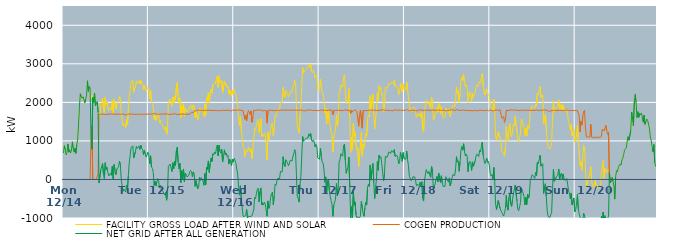
| Category | FACILITY GROSS LOAD AFTER WIND AND SOLAR | COGEN PRODUCTION | NET GRID AFTER ALL GENERATION |
|---|---|---|---|
|  Mon  12/14 | 686 | 0 | 686 |
|  Mon  12/14 | 877 | 0 | 877 |
|  Mon  12/14 | 775 | 0 | 775 |
|  Mon  12/14 | 638 | 0 | 638 |
|  Mon  12/14 | 699 | 0 | 699 |
|  Mon  12/14 | 922 | 0 | 922 |
|  Mon  12/14 | 709 | 0 | 709 |
|  Mon  12/14 | 772 | 0 | 772 |
|  Mon  12/14 | 685 | 0 | 685 |
|  Mon  12/14 | 762 | 0 | 762 |
|  Mon  12/14 | 978 | 0 | 978 |
|  Mon  12/14 | 806 | 0 | 806 |
|  Mon  12/14 | 710 | 0 | 710 |
|  Mon  12/14 | 811 | 0 | 811 |
|  Mon  12/14 | 678 | 0 | 678 |
|  Mon  12/14 | 904 | 0 | 904 |
|  Mon  12/14 | 1043 | 0 | 1043 |
|  Mon  12/14 | 1416 | 0 | 1416 |
|  Mon  12/14 | 1896 | 0 | 1896 |
|  Mon  12/14 | 2225 | 0 | 2225 |
|  Mon  12/14 | 2151 | 0 | 2151 |
|  Mon  12/14 | 2109 | 0 | 2109 |
|  Mon  12/14 | 2145 | 0 | 2145 |
|  Mon  12/14 | 2076 | 0 | 2076 |
|  Mon  12/14 | 1991 | 0 | 1991 |
|  Mon  12/14 | 2085 | 0 | 2085 |
|  Mon  12/14 | 2187 | 0 | 2187 |
|  Mon  12/14 | 2560 | 0 | 2560 |
|  Mon  12/14 | 2285 | 0 | 2285 |
|  Mon  12/14 | 2413 | 0 | 2413 |
|  Mon  12/14 | 2372 | 0 | 2372 |
|  Mon  12/14 | 2094 | 992 | 1102 |
|  Mon  12/14 | 2180 | 1396 | 784 |
|  Mon  12/14 | 2130 | 0 | 2130 |
|  Mon  12/14 | 1999 | 0 | 1999 |
|  Mon  12/14 | 2235 | 0 | 2235 |
|  Mon  12/14 | 1907 | 0 | 1907 |
|  Mon  12/14 | 1952 | 0 | 1952 |
|  Mon  12/14 | 2021 | 0 | 2021 |
|  Mon  12/14 | 1903 | 153 | 1750 |
|  Mon  12/14 | 1593 | 1685 | -92 |
|  Mon  12/14 | 1621 | 1691 | -70 |
|  Mon  12/14 | 1948 | 1695 | 253 |
|  Mon  12/14 | 1963 | 1693 | 270 |
|  Mon  12/14 | 2107 | 1694 | 413 |
|  Mon  12/14 | 1837 | 1693 | 144 |
|  Mon  12/14 | 1718 | 1694 | 24 |
|  Mon  12/14 | 2124 | 1690 | 434 |
|  Mon  12/14 | 1940 | 1684 | 256 |
|  Mon  12/14 | 2005 | 1692 | 313 |
|  Mon  12/14 | 1866 | 1685 | 181 |
|  Mon  12/14 | 1786 | 1695 | 91 |
|  Mon  12/14 | 1816 | 1697 | 119 |
|  Mon  12/14 | 1859 | 1696 | 163 |
|  Mon  12/14 | 1807 | 1698 | 109 |
|  Mon  12/14 | 2042 | 1701 | 341 |
|  Mon  12/14 | 1700 | 1700 | 0 |
|  Mon  12/14 | 2078 | 1692 | 386 |
|  Mon  12/14 | 1932 | 1694 | 238 |
|  Mon  12/14 | 1822 | 1698 | 124 |
|  Mon  12/14 | 1950 | 1687 | 263 |
|  Mon  12/14 | 1947 | 1699 | 248 |
|  Mon  12/14 | 2030 | 1702 | 328 |
|  Mon  12/14 | 2149 | 1681 | 468 |
|  Mon  12/14 | 2078 | 1685 | 393 |
|  Mon  12/14 | 1693 | 1697 | -4 |
|  Mon  12/14 | 1533 | 1699 | -166 |
|  Mon  12/14 | 1387 | 1696 | -309 |
|  Mon  12/14 | 1447 | 1697 | -250 |
|  Mon  12/14 | 1421 | 1687 | -266 |
|  Mon  12/14 | 1342 | 1670 | -328 |
|  Mon  12/14 | 1550 | 1693 | -143 |
|  Mon  12/14 | 1425 | 1693 | -268 |
|  Mon  12/14 | 1797 | 1695 | 102 |
|  Mon  12/14 | 2134 | 1697 | 437 |
|  Mon  12/14 | 2315 | 1691 | 624 |
|  Mon  12/14 | 2521 | 1700 | 821 |
|  Mon  12/14 | 2505 | 1683 | 822 |
|  Mon  12/14 | 2565 | 1694 | 871 |
|  Mon  12/14 | 2255 | 1699 | 556 |
|  Mon  12/14 | 2260 | 1684 | 576 |
|  Mon  12/14 | 2426 | 1699 | 727 |
|  Mon  12/14 | 2557 | 1697 | 860 |
|  Mon  12/14 | 2493 | 1691 | 802 |
|  Mon  12/14 | 2506 | 1687 | 819 |
|  Mon  12/14 | 2563 | 1695 | 868 |
|  Mon  12/14 | 2475 | 1695 | 780 |
|  Mon  12/14 | 2575 | 1689 | 886 |
|  Mon  12/14 | 2498 | 1690 | 808 |
|  Mon  12/14 | 2458 | 1681 | 777 |
|  Mon  12/14 | 2331 | 1690 | 641 |
|  Mon  12/14 | 2448 | 1695 | 753 |
|  Mon  12/14 | 2355 | 1691 | 664 |
|  Mon  12/14 | 2287 | 1708 | 579 |
|  Mon  12/14 | 2330 | 1694 | 636 |
|  Mon  12/14 | 2401 | 1695 | 706 |
|  Tue  12/15 | 2338 | 1700 | 638 |
|  Tue  12/15 | 2092 | 1682 | 410 |
|  Tue  12/15 | 2309 | 1696 | 613 |
|  Tue  12/15 | 2020 | 1690 | 330 |
|  Tue  12/15 | 1982 | 1697 | 285 |
|  Tue  12/15 | 1865 | 1678 | 187 |
|  Tue  12/15 | 1557 | 1712 | -155 |
|  Tue  12/15 | 1654 | 1700 | -46 |
|  Tue  12/15 | 1532 | 1696 | -164 |
|  Tue  12/15 | 1626 | 1699 | -73 |
|  Tue  12/15 | 1712 | 1689 | 23 |
|  Tue  12/15 | 1680 | 1706 | -26 |
|  Tue  12/15 | 1472 | 1691 | -219 |
|  Tue  12/15 | 1535 | 1692 | -157 |
|  Tue  12/15 | 1441 | 1694 | -253 |
|  Tue  12/15 | 1420 | 1692 | -272 |
|  Tue  12/15 | 1385 | 1701 | -316 |
|  Tue  12/15 | 1378 | 1689 | -311 |
|  Tue  12/15 | 1291 | 1695 | -404 |
|  Tue  12/15 | 1367 | 1708 | -341 |
|  Tue  12/15 | 1166 | 1705 | -539 |
|  Tue  12/15 | 1298 | 1695 | -397 |
|  Tue  12/15 | 2030 | 1693 | 337 |
|  Tue  12/15 | 2008 | 1693 | 315 |
|  Tue  12/15 | 2083 | 1683 | 400 |
|  Tue  12/15 | 1988 | 1690 | 298 |
|  Tue  12/15 | 1900 | 1694 | 206 |
|  Tue  12/15 | 2138 | 1705 | 433 |
|  Tue  12/15 | 1982 | 1703 | 279 |
|  Tue  12/15 | 2165 | 1696 | 469 |
|  Tue  12/15 | 2066 | 1702 | 364 |
|  Tue  12/15 | 2421 | 1683 | 738 |
|  Tue  12/15 | 2522 | 1682 | 840 |
|  Tue  12/15 | 2148 | 1696 | 452 |
|  Tue  12/15 | 1966 | 1691 | 275 |
|  Tue  12/15 | 2107 | 1690 | 417 |
|  Tue  12/15 | 1607 | 1688 | -81 |
|  Tue  12/15 | 1931 | 1700 | 231 |
|  Tue  12/15 | 1719 | 1701 | 18 |
|  Tue  12/15 | 1966 | 1694 | 272 |
|  Tue  12/15 | 1639 | 1693 | -54 |
|  Tue  12/15 | 1856 | 1692 | 164 |
|  Tue  12/15 | 1798 | 1687 | 111 |
|  Tue  12/15 | 1757 | 1691 | 66 |
|  Tue  12/15 | 1771 | 1693 | 78 |
|  Tue  12/15 | 1788 | 1681 | 107 |
|  Tue  12/15 | 1896 | 1697 | 199 |
|  Tue  12/15 | 1933 | 1699 | 234 |
|  Tue  12/15 | 1941 | 1734 | 207 |
|  Tue  12/15 | 1803 | 1737 | 66 |
|  Tue  12/15 | 1938 | 1741 | 197 |
|  Tue  12/15 | 1898 | 1741 | 157 |
|  Tue  12/15 | 1601 | 1780 | -179 |
|  Tue  12/15 | 1768 | 1799 | -31 |
|  Tue  12/15 | 1743 | 1786 | -43 |
|  Tue  12/15 | 1548 | 1791 | -243 |
|  Tue  12/15 | 1589 | 1801 | -212 |
|  Tue  12/15 | 1853 | 1796 | 57 |
|  Tue  12/15 | 1775 | 1799 | -24 |
|  Tue  12/15 | 1839 | 1792 | 47 |
|  Tue  12/15 | 1839 | 1796 | 43 |
|  Tue  12/15 | 1748 | 1788 | -40 |
|  Tue  12/15 | 1631 | 1783 | -152 |
|  Tue  12/15 | 1949 | 1796 | 153 |
|  Tue  12/15 | 1664 | 1799 | -135 |
|  Tue  12/15 | 2118 | 1799 | 319 |
|  Tue  12/15 | 2050 | 1790 | 260 |
|  Tue  12/15 | 2253 | 1772 | 481 |
|  Tue  12/15 | 1979 | 1798 | 181 |
|  Tue  12/15 | 2221 | 1806 | 415 |
|  Tue  12/15 | 2348 | 1789 | 559 |
|  Tue  12/15 | 2236 | 1771 | 465 |
|  Tue  12/15 | 2454 | 1787 | 667 |
|  Tue  12/15 | 2432 | 1794 | 638 |
|  Tue  12/15 | 2505 | 1792 | 713 |
|  Tue  12/15 | 2477 | 1806 | 671 |
|  Tue  12/15 | 2596 | 1790 | 806 |
|  Tue  12/15 | 2676 | 1786 | 890 |
|  Tue  12/15 | 2392 | 1779 | 613 |
|  Tue  12/15 | 2686 | 1794 | 892 |
|  Tue  12/15 | 2518 | 1794 | 724 |
|  Tue  12/15 | 2472 | 1789 | 683 |
|  Tue  12/15 | 2563 | 1783 | 780 |
|  Tue  12/15 | 2248 | 1791 | 457 |
|  Tue  12/15 | 2394 | 1801 | 593 |
|  Tue  12/15 | 2558 | 1788 | 770 |
|  Tue  12/15 | 2433 | 1788 | 645 |
|  Tue  12/15 | 2480 | 1796 | 684 |
|  Tue  12/15 | 2387 | 1790 | 597 |
|  Tue  12/15 | 2428 | 1801 | 627 |
|  Tue  12/15 | 2203 | 1804 | 399 |
|  Tue  12/15 | 2316 | 1793 | 523 |
|  Tue  12/15 | 2216 | 1773 | 443 |
|  Tue  12/15 | 2156 | 1794 | 362 |
|  Tue  12/15 | 2320 | 1796 | 524 |
|  Tue  12/15 | 2233 | 1782 | 451 |
|  Wed  12/16 | 2345 | 1797 | 548 |
|  Wed  12/16 | 2278 | 1787 | 491 |
|  Wed  12/16 | 2207 | 1799 | 408 |
|  Wed  12/16 | 2054 | 1790 | 264 |
|  Wed  12/16 | 1917 | 1796 | 121 |
|  Wed  12/16 | 1572 | 1785 | -213 |
|  Wed  12/16 | 1397 | 1804 | -407 |
|  Wed  12/16 | 1629 | 1793 | -164 |
|  Wed  12/16 | 1288 | 1787 | -499 |
|  Wed  12/16 | 1293 | 1791 | -498 |
|  Wed  12/16 | 850 | 1793 | -943 |
|  Wed  12/16 | 822 | 1793 | -971 |
|  Wed  12/16 | 596 | 1559 | -963 |
|  Wed  12/16 | 754 | 1672 | -918 |
|  Wed  12/16 | 738 | 1516 | -778 |
|  Wed  12/16 | 712 | 1710 | -998 |
|  Wed  12/16 | 838 | 1788 | -950 |
|  Wed  12/16 | 846 | 1811 | -965 |
|  Wed  12/16 | 715 | 1682 | -967 |
|  Wed  12/16 | 798 | 1778 | -980 |
|  Wed  12/16 | 543 | 1484 | -941 |
|  Wed  12/16 | 762 | 1625 | -863 |
|  Wed  12/16 | 1008 | 1798 | -790 |
|  Wed  12/16 | 1322 | 1793 | -471 |
|  Wed  12/16 | 1288 | 1787 | -499 |
|  Wed  12/16 | 1400 | 1772 | -372 |
|  Wed  12/16 | 1534 | 1800 | -266 |
|  Wed  12/16 | 1560 | 1787 | -227 |
|  Wed  12/16 | 1218 | 1804 | -586 |
|  Wed  12/16 | 1483 | 1796 | -313 |
|  Wed  12/16 | 1579 | 1798 | -219 |
|  Wed  12/16 | 1111 | 1774 | -663 |
|  Wed  12/16 | 1178 | 1778 | -600 |
|  Wed  12/16 | 1121 | 1787 | -666 |
|  Wed  12/16 | 1197 | 1789 | -592 |
|  Wed  12/16 | 1152 | 1795 | -643 |
|  Wed  12/16 | 1151 | 1789 | -638 |
|  Wed  12/16 | 505 | 1460 | -955 |
|  Wed  12/16 | 1233 | 1790 | -557 |
|  Wed  12/16 | 1041 | 1791 | -750 |
|  Wed  12/16 | 1109 | 1797 | -688 |
|  Wed  12/16 | 1320 | 1791 | -471 |
|  Wed  12/16 | 1422 | 1793 | -371 |
|  Wed  12/16 | 1467 | 1797 | -330 |
|  Wed  12/16 | 1126 | 1784 | -658 |
|  Wed  12/16 | 1358 | 1794 | -436 |
|  Wed  12/16 | 1671 | 1795 | -124 |
|  Wed  12/16 | 1642 | 1794 | -152 |
|  Wed  12/16 | 1738 | 1789 | -51 |
|  Wed  12/16 | 1816 | 1784 | 32 |
|  Wed  12/16 | 1820 | 1796 | 24 |
|  Wed  12/16 | 1818 | 1802 | 16 |
|  Wed  12/16 | 1994 | 1790 | 204 |
|  Wed  12/16 | 1975 | 1791 | 184 |
|  Wed  12/16 | 2000 | 1804 | 196 |
|  Wed  12/16 | 2388 | 1798 | 590 |
|  Wed  12/16 | 2186 | 1795 | 391 |
|  Wed  12/16 | 2123 | 1792 | 331 |
|  Wed  12/16 | 2308 | 1798 | 510 |
|  Wed  12/16 | 2283 | 1784 | 499 |
|  Wed  12/16 | 2227 | 1796 | 431 |
|  Wed  12/16 | 2137 | 1782 | 355 |
|  Wed  12/16 | 2199 | 1795 | 404 |
|  Wed  12/16 | 2280 | 1780 | 500 |
|  Wed  12/16 | 2300 | 1797 | 503 |
|  Wed  12/16 | 2271 | 1792 | 479 |
|  Wed  12/16 | 2383 | 1799 | 584 |
|  Wed  12/16 | 2460 | 1792 | 668 |
|  Wed  12/16 | 2574 | 1799 | 775 |
|  Wed  12/16 | 2521 | 1793 | 728 |
|  Wed  12/16 | 1922 | 1794 | 128 |
|  Wed  12/16 | 1351 | 1799 | -448 |
|  Wed  12/16 | 1306 | 1802 | -496 |
|  Wed  12/16 | 1211 | 1798 | -587 |
|  Wed  12/16 | 1666 | 1793 | -127 |
|  Wed  12/16 | 1868 | 1797 | 71 |
|  Wed  12/16 | 2418 | 1806 | 612 |
|  Wed  12/16 | 2903 | 1788 | 1115 |
|  Wed  12/16 | 2771 | 1780 | 991 |
|  Wed  12/16 | 2811 | 1793 | 1018 |
|  Wed  12/16 | 2830 | 1783 | 1047 |
|  Wed  12/16 | 2859 | 1784 | 1075 |
|  Wed  12/16 | 2889 | 1801 | 1088 |
|  Wed  12/16 | 2866 | 1792 | 1074 |
|  Wed  12/16 | 2984 | 1798 | 1186 |
|  Wed  12/16 | 2904 | 1783 | 1121 |
|  Wed  12/16 | 2996 | 1804 | 1192 |
|  Wed  12/16 | 2820 | 1794 | 1026 |
|  Wed  12/16 | 2760 | 1786 | 974 |
|  Wed  12/16 | 2832 | 1804 | 1028 |
|  Wed  12/16 | 2772 | 1794 | 978 |
|  Wed  12/16 | 2635 | 1794 | 841 |
|  Wed  12/16 | 2695 | 1789 | 906 |
|  Wed  12/16 | 2653 | 1800 | 853 |
|  Wed  12/16 | 2346 | 1787 | 559 |
|  Wed  12/16 | 2336 | 1796 | 540 |
|  Thu  12/17 | 2308 | 1785 | 523 |
|  Thu  12/17 | 2605 | 1795 | 810 |
|  Thu  12/17 | 2411 | 1807 | 604 |
|  Thu  12/17 | 2244 | 1796 | 448 |
|  Thu  12/17 | 2213 | 1792 | 421 |
|  Thu  12/17 | 2044 | 1790 | 254 |
|  Thu  12/17 | 1729 | 1802 | -73 |
|  Thu  12/17 | 1851 | 1784 | 67 |
|  Thu  12/17 | 1440 | 1785 | -345 |
|  Thu  12/17 | 1745 | 1787 | -42 |
|  Thu  12/17 | 1802 | 1794 | 8 |
|  Thu  12/17 | 1485 | 1774 | -289 |
|  Thu  12/17 | 1362 | 1800 | -438 |
|  Thu  12/17 | 1244 | 1791 | -547 |
|  Thu  12/17 | 1148 | 1796 | -648 |
|  Thu  12/17 | 721 | 1678 | -957 |
|  Thu  12/17 | 1121 | 1786 | -665 |
|  Thu  12/17 | 1143 | 1793 | -650 |
|  Thu  12/17 | 1280 | 1791 | -511 |
|  Thu  12/17 | 1691 | 1795 | -104 |
|  Thu  12/17 | 1381 | 1798 | -417 |
|  Thu  12/17 | 1549 | 1789 | -240 |
|  Thu  12/17 | 2236 | 1790 | 446 |
|  Thu  12/17 | 2317 | 1799 | 518 |
|  Thu  12/17 | 2456 | 1789 | 667 |
|  Thu  12/17 | 2441 | 1787 | 654 |
|  Thu  12/17 | 2388 | 1787 | 601 |
|  Thu  12/17 | 2669 | 1800 | 869 |
|  Thu  12/17 | 2714 | 1799 | 915 |
|  Thu  12/17 | 2291 | 1797 | 494 |
|  Thu  12/17 | 1965 | 1804 | 161 |
|  Thu  12/17 | 2064 | 1800 | 264 |
|  Thu  12/17 | 2106 | 1785 | 321 |
|  Thu  12/17 | 2364 | 1781 | 583 |
|  Thu  12/17 | 1605 | 1803 | -198 |
|  Thu  12/17 | 704 | 1712 | -1008 |
|  Thu  12/17 | 1093 | 1798 | -705 |
|  Thu  12/17 | 763 | 1747 | -984 |
|  Thu  12/17 | 1463 | 1788 | -325 |
|  Thu  12/17 | 1122 | 1789 | -667 |
|  Thu  12/17 | 1223 | 1806 | -583 |
|  Thu  12/17 | 864 | 1789 | -925 |
|  Thu  12/17 | 777 | 1769 | -992 |
|  Thu  12/17 | 829 | 1792 | -963 |
|  Thu  12/17 | 332 | 1379 | -1047 |
|  Thu  12/17 | 640 | 1672 | -1032 |
|  Thu  12/17 | 862 | 1803 | -941 |
|  Thu  12/17 | 1222 | 1789 | -567 |
|  Thu  12/17 | 595 | 1331 | -736 |
|  Thu  12/17 | 912 | 1790 | -878 |
|  Thu  12/17 | 834 | 1790 | -956 |
|  Thu  12/17 | 1056 | 1789 | -733 |
|  Thu  12/17 | 1202 | 1792 | -590 |
|  Thu  12/17 | 1120 | 1785 | -665 |
|  Thu  12/17 | 1584 | 1790 | -206 |
|  Thu  12/17 | 1666 | 1789 | -123 |
|  Thu  12/17 | 1616 | 1803 | -187 |
|  Thu  12/17 | 2174 | 1798 | 376 |
|  Thu  12/17 | 1795 | 1812 | -17 |
|  Thu  12/17 | 2061 | 1802 | 259 |
|  Thu  12/17 | 2218 | 1804 | 414 |
|  Thu  12/17 | 1713 | 1795 | -82 |
|  Thu  12/17 | 1313 | 1808 | -495 |
|  Thu  12/17 | 1577 | 1794 | -217 |
|  Thu  12/17 | 1793 | 1790 | 3 |
|  Thu  12/17 | 2250 | 1785 | 465 |
|  Thu  12/17 | 2041 | 1804 | 237 |
|  Thu  12/17 | 2430 | 1800 | 630 |
|  Thu  12/17 | 2349 | 1788 | 561 |
|  Thu  12/17 | 2382 | 1791 | 591 |
|  Thu  12/17 | 2195 | 1789 | 406 |
|  Thu  12/17 | 2221 | 1813 | 408 |
|  Thu  12/17 | 1762 | 1800 | -38 |
|  Thu  12/17 | 1922 | 1795 | 127 |
|  Thu  12/17 | 2394 | 1799 | 595 |
|  Thu  12/17 | 2389 | 1800 | 589 |
|  Thu  12/17 | 2360 | 1785 | 575 |
|  Thu  12/17 | 2372 | 1789 | 583 |
|  Thu  12/17 | 2496 | 1779 | 717 |
|  Thu  12/17 | 2489 | 1787 | 702 |
|  Thu  12/17 | 2474 | 1798 | 676 |
|  Thu  12/17 | 2529 | 1786 | 743 |
|  Thu  12/17 | 2513 | 1780 | 733 |
|  Thu  12/17 | 2483 | 1783 | 700 |
|  Thu  12/17 | 2574 | 1800 | 774 |
|  Thu  12/17 | 2415 | 1813 | 602 |
|  Thu  12/17 | 2392 | 1790 | 602 |
|  Thu  12/17 | 2415 | 1792 | 623 |
|  Thu  12/17 | 2355 | 1789 | 566 |
|  Thu  12/17 | 2203 | 1799 | 404 |
|  Thu  12/17 | 2253 | 1799 | 454 |
|  Thu  12/17 | 2496 | 1795 | 701 |
|  Thu  12/17 | 2374 | 1788 | 586 |
|  Thu  12/17 | 2262 | 1793 | 469 |
|  Thu  12/17 | 2479 | 1782 | 697 |
|  Thu  12/17 | 2333 | 1795 | 538 |
|  Fri  12/18 | 2326 | 1794 | 532 |
|  Fri  12/18 | 2319 | 1796 | 523 |
|  Fri  12/18 | 2532 | 1793 | 739 |
|  Fri  12/18 | 2322 | 1808 | 514 |
|  Fri  12/18 | 2142 | 1782 | 360 |
|  Fri  12/18 | 1889 | 1807 | 82 |
|  Fri  12/18 | 1868 | 1788 | 80 |
|  Fri  12/18 | 1755 | 1788 | -33 |
|  Fri  12/18 | 1792 | 1794 | -2 |
|  Fri  12/18 | 1863 | 1793 | 70 |
|  Fri  12/18 | 1853 | 1802 | 51 |
|  Fri  12/18 | 1866 | 1799 | 67 |
|  Fri  12/18 | 1761 | 1784 | -23 |
|  Fri  12/18 | 1611 | 1785 | -174 |
|  Fri  12/18 | 1665 | 1783 | -118 |
|  Fri  12/18 | 1703 | 1800 | -97 |
|  Fri  12/18 | 1641 | 1806 | -165 |
|  Fri  12/18 | 1717 | 1793 | -76 |
|  Fri  12/18 | 1610 | 1802 | -192 |
|  Fri  12/18 | 1730 | 1791 | -61 |
|  Fri  12/18 | 1318 | 1798 | -480 |
|  Fri  12/18 | 1234 | 1795 | -561 |
|  Fri  12/18 | 1751 | 1791 | -40 |
|  Fri  12/18 | 1919 | 1803 | 116 |
|  Fri  12/18 | 2052 | 1796 | 256 |
|  Fri  12/18 | 1998 | 1801 | 197 |
|  Fri  12/18 | 1950 | 1799 | 151 |
|  Fri  12/18 | 2015 | 1805 | 210 |
|  Fri  12/18 | 1905 | 1793 | 112 |
|  Fri  12/18 | 1843 | 1789 | 54 |
|  Fri  12/18 | 2126 | 1793 | 333 |
|  Fri  12/18 | 2014 | 1790 | 224 |
|  Fri  12/18 | 1541 | 1804 | -263 |
|  Fri  12/18 | 1589 | 1793 | -204 |
|  Fri  12/18 | 1589 | 1788 | -199 |
|  Fri  12/18 | 1801 | 1805 | -4 |
|  Fri  12/18 | 1880 | 1800 | 80 |
|  Fri  12/18 | 1743 | 1806 | -63 |
|  Fri  12/18 | 1972 | 1804 | 168 |
|  Fri  12/18 | 1946 | 1801 | 145 |
|  Fri  12/18 | 1717 | 1792 | -75 |
|  Fri  12/18 | 1888 | 1792 | 96 |
|  Fri  12/18 | 1702 | 1793 | -91 |
|  Fri  12/18 | 1610 | 1792 | -182 |
|  Fri  12/18 | 1631 | 1802 | -171 |
|  Fri  12/18 | 1614 | 1795 | -181 |
|  Fri  12/18 | 1853 | 1782 | 71 |
|  Fri  12/18 | 1849 | 1787 | 62 |
|  Fri  12/18 | 1761 | 1783 | -22 |
|  Fri  12/18 | 1727 | 1798 | -71 |
|  Fri  12/18 | 1837 | 1794 | 43 |
|  Fri  12/18 | 1631 | 1801 | -170 |
|  Fri  12/18 | 1737 | 1807 | -70 |
|  Fri  12/18 | 1851 | 1809 | 42 |
|  Fri  12/18 | 1933 | 1805 | 128 |
|  Fri  12/18 | 1939 | 1808 | 131 |
|  Fri  12/18 | 1883 | 1785 | 98 |
|  Fri  12/18 | 2050 | 1777 | 273 |
|  Fri  12/18 | 2401 | 1809 | 592 |
|  Fri  12/18 | 2234 | 1787 | 447 |
|  Fri  12/18 | 2285 | 1803 | 482 |
|  Fri  12/18 | 2000 | 1788 | 212 |
|  Fri  12/18 | 2236 | 1788 | 448 |
|  Fri  12/18 | 2560 | 1798 | 762 |
|  Fri  12/18 | 2650 | 1800 | 850 |
|  Fri  12/18 | 2558 | 1797 | 761 |
|  Fri  12/18 | 2723 | 1797 | 926 |
|  Fri  12/18 | 2526 | 1791 | 735 |
|  Fri  12/18 | 2404 | 1792 | 612 |
|  Fri  12/18 | 2459 | 1799 | 660 |
|  Fri  12/18 | 2380 | 1788 | 592 |
|  Fri  12/18 | 1999 | 1797 | 202 |
|  Fri  12/18 | 2217 | 1785 | 432 |
|  Fri  12/18 | 2278 | 1806 | 472 |
|  Fri  12/18 | 2215 | 1791 | 424 |
|  Fri  12/18 | 2025 | 1790 | 235 |
|  Fri  12/18 | 2236 | 1780 | 456 |
|  Fri  12/18 | 2134 | 1792 | 342 |
|  Fri  12/18 | 2118 | 1789 | 329 |
|  Fri  12/18 | 2266 | 1781 | 485 |
|  Fri  12/18 | 2402 | 1794 | 608 |
|  Fri  12/18 | 2452 | 1794 | 658 |
|  Fri  12/18 | 2408 | 1778 | 630 |
|  Fri  12/18 | 2396 | 1802 | 594 |
|  Fri  12/18 | 2552 | 1797 | 755 |
|  Fri  12/18 | 2502 | 1790 | 712 |
|  Fri  12/18 | 2644 | 1792 | 852 |
|  Fri  12/18 | 2762 | 1793 | 969 |
|  Fri  12/18 | 2430 | 1793 | 637 |
|  Fri  12/18 | 2303 | 1797 | 506 |
|  Fri  12/18 | 2194 | 1784 | 410 |
|  Fri  12/18 | 2273 | 1800 | 473 |
|  Fri  12/18 | 2349 | 1801 | 548 |
|  Fri  12/18 | 2235 | 1794 | 441 |
|  Fri  12/18 | 2253 | 1783 | 470 |
|  Fri  12/18 | 2160 | 1808 | 352 |
|  Sat  12/19 | 1953 | 1804 | 149 |
|  Sat  12/19 | 1893 | 1803 | 90 |
|  Sat  12/19 | 1916 | 1790 | 126 |
|  Sat  12/19 | 1775 | 1788 | -13 |
|  Sat  12/19 | 2080 | 1771 | 309 |
|  Sat  12/19 | 1757 | 1801 | -44 |
|  Sat  12/19 | 1151 | 1797 | -646 |
|  Sat  12/19 | 1017 | 1800 | -783 |
|  Sat  12/19 | 1007 | 1795 | -788 |
|  Sat  12/19 | 1242 | 1790 | -548 |
|  Sat  12/19 | 1234 | 1788 | -554 |
|  Sat  12/19 | 1056 | 1807 | -751 |
|  Sat  12/19 | 987 | 1792 | -805 |
|  Sat  12/19 | 741 | 1593 | -852 |
|  Sat  12/19 | 765 | 1602 | -837 |
|  Sat  12/19 | 681 | 1630 | -949 |
|  Sat  12/19 | 602 | 1481 | -879 |
|  Sat  12/19 | 783 | 1539 | -756 |
|  Sat  12/19 | 1384 | 1799 | -415 |
|  Sat  12/19 | 1086 | 1802 | -716 |
|  Sat  12/19 | 986 | 1784 | -798 |
|  Sat  12/19 | 1322 | 1795 | -473 |
|  Sat  12/19 | 1448 | 1797 | -349 |
|  Sat  12/19 | 1159 | 1800 | -641 |
|  Sat  12/19 | 1108 | 1808 | -700 |
|  Sat  12/19 | 1257 | 1781 | -524 |
|  Sat  12/19 | 1432 | 1811 | -379 |
|  Sat  12/19 | 1398 | 1796 | -398 |
|  Sat  12/19 | 1649 | 1795 | -146 |
|  Sat  12/19 | 1662 | 1789 | -127 |
|  Sat  12/19 | 1230 | 1795 | -565 |
|  Sat  12/19 | 1016 | 1791 | -775 |
|  Sat  12/19 | 977 | 1787 | -810 |
|  Sat  12/19 | 1077 | 1787 | -710 |
|  Sat  12/19 | 1192 | 1789 | -597 |
|  Sat  12/19 | 1570 | 1790 | -220 |
|  Sat  12/19 | 1486 | 1797 | -311 |
|  Sat  12/19 | 1426 | 1781 | -355 |
|  Sat  12/19 | 1340 | 1793 | -453 |
|  Sat  12/19 | 1137 | 1796 | -659 |
|  Sat  12/19 | 1333 | 1797 | -464 |
|  Sat  12/19 | 1126 | 1778 | -652 |
|  Sat  12/19 | 1409 | 1795 | -386 |
|  Sat  12/19 | 1315 | 1800 | -485 |
|  Sat  12/19 | 1408 | 1796 | -388 |
|  Sat  12/19 | 1779 | 1805 | -26 |
|  Sat  12/19 | 1817 | 1785 | 32 |
|  Sat  12/19 | 1913 | 1790 | 123 |
|  Sat  12/19 | 1909 | 1793 | 116 |
|  Sat  12/19 | 1877 | 1798 | 79 |
|  Sat  12/19 | 1824 | 1796 | 28 |
|  Sat  12/19 | 1963 | 1782 | 181 |
|  Sat  12/19 | 1902 | 1803 | 99 |
|  Sat  12/19 | 2232 | 1788 | 444 |
|  Sat  12/19 | 2194 | 1785 | 409 |
|  Sat  12/19 | 2309 | 1792 | 517 |
|  Sat  12/19 | 2423 | 1796 | 627 |
|  Sat  12/19 | 2123 | 1780 | 343 |
|  Sat  12/19 | 2117 | 1793 | 324 |
|  Sat  12/19 | 2197 | 1789 | 408 |
|  Sat  12/19 | 1439 | 1803 | -364 |
|  Sat  12/19 | 1432 | 1800 | -368 |
|  Sat  12/19 | 1690 | 1802 | -112 |
|  Sat  12/19 | 1343 | 1783 | -440 |
|  Sat  12/19 | 980 | 1792 | -812 |
|  Sat  12/19 | 843 | 1800 | -957 |
|  Sat  12/19 | 816 | 1766 | -950 |
|  Sat  12/19 | 790 | 1776 | -986 |
|  Sat  12/19 | 861 | 1780 | -919 |
|  Sat  12/19 | 947 | 1805 | -858 |
|  Sat  12/19 | 1537 | 1786 | -249 |
|  Sat  12/19 | 2046 | 1786 | 260 |
|  Sat  12/19 | 1744 | 1793 | -49 |
|  Sat  12/19 | 1732 | 1789 | -57 |
|  Sat  12/19 | 1840 | 1791 | 49 |
|  Sat  12/19 | 1883 | 1792 | 91 |
|  Sat  12/19 | 1919 | 1788 | 131 |
|  Sat  12/19 | 2065 | 1793 | 272 |
|  Sat  12/19 | 1791 | 1798 | -7 |
|  Sat  12/19 | 1899 | 1782 | 117 |
|  Sat  12/19 | 1959 | 1791 | 168 |
|  Sat  12/19 | 1804 | 1789 | 15 |
|  Sat  12/19 | 1933 | 1790 | 143 |
|  Sat  12/19 | 1788 | 1796 | -8 |
|  Sat  12/19 | 1808 | 1793 | 15 |
|  Sat  12/19 | 1782 | 1800 | -18 |
|  Sat  12/19 | 1826 | 1803 | 23 |
|  Sat  12/19 | 1664 | 1786 | -122 |
|  Sat  12/19 | 1498 | 1790 | -292 |
|  Sat  12/19 | 1431 | 1789 | -358 |
|  Sat  12/19 | 1292 | 1793 | -501 |
|  Sat  12/19 | 1426 | 1786 | -360 |
|  Sat  12/19 | 1126 | 1784 | -658 |
|  Sat  12/19 | 1120 | 1788 | -668 |
|  Sat  12/19 | 1305 | 1787 | -482 |
|  Sat  12/19 | 967 | 1805 | -838 |
|  Sun  12/20 | 1005 | 1790 | -785 |
|  Sun  12/20 | 1152 | 1795 | -643 |
|  Sun  12/20 | 1395 | 1785 | -390 |
|  Sun  12/20 | 1021 | 1784 | -763 |
|  Sun  12/20 | 754 | 1651 | -897 |
|  Sun  12/20 | 357 | 1234 | -877 |
|  Sun  12/20 | 461 | 1516 | -1055 |
|  Sun  12/20 | 239 | 1409 | -1170 |
|  Sun  12/20 | 574 | 1623 | -1049 |
|  Sun  12/20 | 883 | 1762 | -879 |
|  Sun  12/20 | 841 | 1794 | -953 |
|  Sun  12/20 | 305 | 1360 | -1055 |
|  Sun  12/20 | -213 | 1102 | -1315 |
|  Sun  12/20 | -225 | 1096 | -1321 |
|  Sun  12/20 | 3 | 1100 | -1097 |
|  Sun  12/20 | 59 | 1102 | -1043 |
|  Sun  12/20 | 40 | 1101 | -1061 |
|  Sun  12/20 | 334 | 1430 | -1096 |
|  Sun  12/20 | -50 | 1099 | -1149 |
|  Sun  12/20 | -136 | 1084 | -1220 |
|  Sun  12/20 | -205 | 1080 | -1285 |
|  Sun  12/20 | -133 | 1093 | -1226 |
|  Sun  12/20 | -22 | 1104 | -1126 |
|  Sun  12/20 | -180 | 1097 | -1277 |
|  Sun  12/20 | -147 | 1085 | -1232 |
|  Sun  12/20 | -127 | 1088 | -1215 |
|  Sun  12/20 | -232 | 1097 | -1329 |
|  Sun  12/20 | -206 | 1094 | -1300 |
|  Sun  12/20 | -150 | 1097 | -1247 |
|  Sun  12/20 | 168 | 1126 | -958 |
|  Sun  12/20 | 191 | 1309 | -1118 |
|  Sun  12/20 | 487 | 1332 | -845 |
|  Sun  12/20 | 4 | 1257 | -1253 |
|  Sun  12/20 | 293 | 1233 | -940 |
|  Sun  12/20 | 256 | 1400 | -1144 |
|  Sun  12/20 | 168 | 1268 | -1100 |
|  Sun  12/20 | 160 | 1169 | -1009 |
|  Sun  12/20 | 271 | 1222 | -951 |
|  Sun  12/20 | 174 | 0 | 174 |
|  Sun  12/20 | -89 | 0 | -89 |
|  Sun  12/20 | -35 | 0 | -35 |
|  Sun  12/20 | 51 | 0 | 51 |
|  Sun  12/20 | -51 | 0 | -51 |
|  Sun  12/20 | -153 | 0 | -153 |
|  Sun  12/20 | -511 | 0 | -511 |
|  Sun  12/20 | 73 | 0 | 73 |
|  Sun  12/20 | 228 | 0 | 228 |
|  Sun  12/20 | 200 | 0 | 200 |
|  Sun  12/20 | 315 | 0 | 315 |
|  Sun  12/20 | 330 | 0 | 330 |
|  Sun  12/20 | 401 | 0 | 401 |
|  Sun  12/20 | 372 | 0 | 372 |
|  Sun  12/20 | 505 | 0 | 505 |
|  Sun  12/20 | 549 | 0 | 549 |
|  Sun  12/20 | 644 | 0 | 644 |
|  Sun  12/20 | 757 | 0 | 757 |
|  Sun  12/20 | 790 | 0 | 790 |
|  Sun  12/20 | 821 | 0 | 821 |
|  Sun  12/20 | 998 | 0 | 998 |
|  Sun  12/20 | 1111 | 0 | 1111 |
|  Sun  12/20 | 1017 | 0 | 1017 |
|  Sun  12/20 | 1026 | 0 | 1026 |
|  Sun  12/20 | 1279 | 0 | 1279 |
|  Sun  12/20 | 1749 | 0 | 1749 |
|  Sun  12/20 | 1560 | 0 | 1560 |
|  Sun  12/20 | 1387 | 0 | 1387 |
|  Sun  12/20 | 2020 | 0 | 2020 |
|  Sun  12/20 | 2208 | 0 | 2208 |
|  Sun  12/20 | 1998 | 0 | 1998 |
|  Sun  12/20 | 1607 | 0 | 1607 |
|  Sun  12/20 | 1758 | 0 | 1758 |
|  Sun  12/20 | 1611 | 0 | 1611 |
|  Sun  12/20 | 1713 | 0 | 1713 |
|  Sun  12/20 | 1673 | 0 | 1673 |
|  Sun  12/20 | 1725 | 0 | 1725 |
|  Sun  12/20 | 1723 | 0 | 1723 |
|  Sun  12/20 | 1485 | 0 | 1485 |
|  Sun  12/20 | 1671 | 0 | 1671 |
|  Sun  12/20 | 1429 | 0 | 1429 |
|  Sun  12/20 | 1497 | 0 | 1497 |
|  Sun  12/20 | 1568 | 0 | 1568 |
|  Sun  12/20 | 1529 | 0 | 1529 |
|  Sun  12/20 | 1436 | 0 | 1436 |
|  Sun  12/20 | 1318 | 0 | 1318 |
|  Sun  12/20 | 1101 | 0 | 1101 |
|  Sun  12/20 | 1008 | 0 | 1008 |
|  Sun  12/20 | 848 | 0 | 848 |
|  Sun  12/20 | 714 | 0 | 714 |
|  Sun  12/20 | 907 | 0 | 907 |
|  Sun  12/20 | 429 | 0 | 429 |
|  Sun  12/20 | 341 | 0 | 341 |
|  Sun  12/20 | 398 | 0 | 398 |